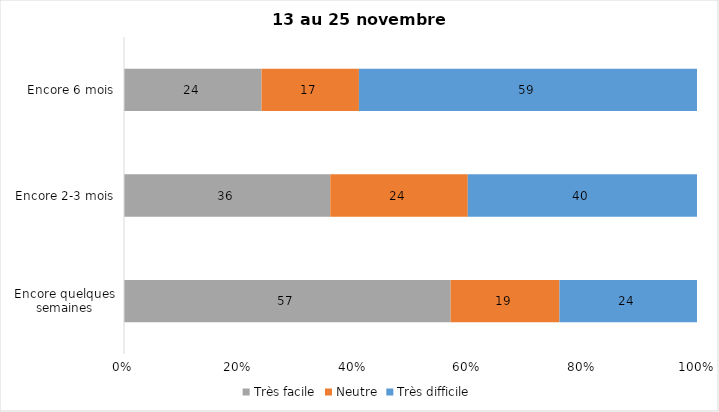
| Category | Très facile | Neutre | Très difficile |
|---|---|---|---|
| Encore quelques semaines | 57 | 19 | 24 |
| Encore 2-3 mois | 36 | 24 | 40 |
| Encore 6 mois | 24 | 17 | 59 |